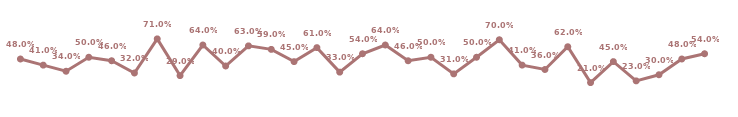
| Category | Bounce Rate |
|---|---|
| 0 | 0.48 |
| 1 | 0.41 |
| 2 | 0.34 |
| 3 | 0.5 |
| 4 | 0.46 |
| 5 | 0.32 |
| 6 | 0.71 |
| 7 | 0.29 |
| 8 | 0.64 |
| 9 | 0.4 |
| 10 | 0.63 |
| 11 | 0.59 |
| 12 | 0.45 |
| 13 | 0.61 |
| 14 | 0.33 |
| 15 | 0.54 |
| 16 | 0.64 |
| 17 | 0.46 |
| 18 | 0.5 |
| 19 | 0.31 |
| 20 | 0.5 |
| 21 | 0.7 |
| 22 | 0.41 |
| 23 | 0.36 |
| 24 | 0.62 |
| 25 | 0.21 |
| 26 | 0.45 |
| 27 | 0.23 |
| 28 | 0.3 |
| 29 | 0.48 |
| 30 | 0.54 |